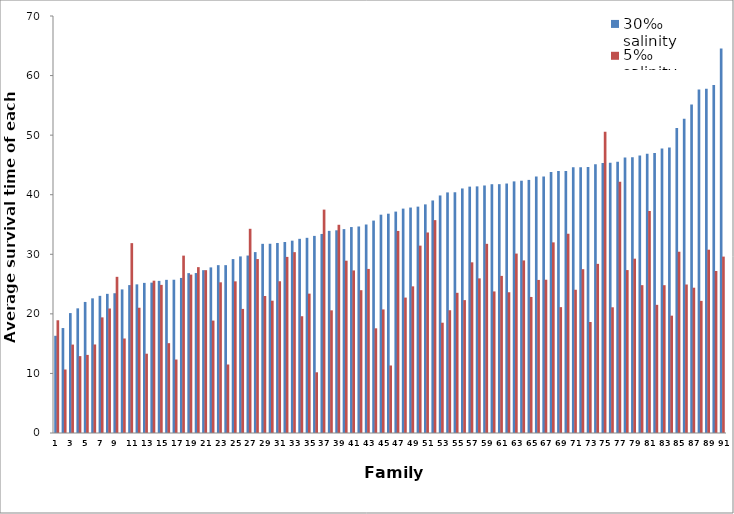
| Category | 30‰ salinity | 5‰ salinity |
|---|---|---|
| 1.0 | 16.319 | 18.923 |
| 2.0 | 17.619 | 10.659 |
| 3.0 | 20.132 | 14.842 |
| 4.0 | 20.927 | 12.906 |
| 5.0 | 22 | 13.111 |
| 6.0 | 22.605 | 14.861 |
| 7.0 | 23.024 | 19.41 |
| 8.0 | 23.359 | 20.9 |
| 9.0 | 23.462 | 26.216 |
| 10.0 | 24.103 | 15.864 |
| 11.0 | 24.829 | 31.872 |
| 12.0 | 24.951 | 21.029 |
| 13.0 | 25.2 | 13.31 |
| 14.0 | 25.238 | 25.568 |
| 15.0 | 25.537 | 24.864 |
| 16.0 | 25.711 | 15.079 |
| 17.0 | 25.729 | 12.333 |
| 18.0 | 26.029 | 29.775 |
| 19.0 | 26.837 | 26.588 |
| 20.0 | 26.85 | 27.842 |
| 21.0 | 27.333 | 27.333 |
| 22.0 | 27.8 | 18.871 |
| 23.0 | 28.175 | 25.294 |
| 24.0 | 28.176 | 11.5 |
| 25.0 | 29.195 | 25.457 |
| 26.0 | 29.641 | 20.829 |
| 27.0 | 29.789 | 34.278 |
| 28.0 | 30.368 | 29.2 |
| 29.0 | 31.756 | 23 |
| 30.0 | 31.767 | 22.209 |
| 31.0 | 31.9 | 25.474 |
| 32.0 | 32.059 | 29.561 |
| 33.0 | 32.286 | 30.359 |
| 34.0 | 32.595 | 19.601 |
| 35.0 | 32.765 | 23.395 |
| 36.0 | 33.087 | 10.19 |
| 37.0 | 33.415 | 37.5 |
| 38.0 | 33.932 | 20.591 |
| 39.0 | 34.026 | 34.953 |
| 40.0 | 34.225 | 28.923 |
| 41.0 | 34.571 | 27.289 |
| 42.0 | 34.667 | 23.974 |
| 43.0 | 35 | 27.543 |
| 44.0 | 35.658 | 17.575 |
| 45.0 | 36.648 | 20.743 |
| 46.0 | 36.816 | 11.333 |
| 47.0 | 37.167 | 33.919 |
| 48.0 | 37.667 | 22.732 |
| 49.0 | 37.846 | 24.617 |
| 50.0 | 38 | 31.452 |
| 51.0 | 38.378 | 33.659 |
| 52.0 | 39.036 | 35.735 |
| 53.0 | 39.875 | 18.514 |
| 54.0 | 40.386 | 20.61 |
| 55.0 | 40.412 | 23.533 |
| 56.0 | 41.05 | 22.306 |
| 57.0 | 41.357 | 28.65 |
| 58.0 | 41.4 | 25.957 |
| 59.0 | 41.55 | 31.756 |
| 60.0 | 41.762 | 23.763 |
| 61.0 | 41.769 | 26.372 |
| 62.0 | 41.878 | 23.625 |
| 63.0 | 42.237 | 30.119 |
| 64.0 | 42.351 | 28.97 |
| 65.0 | 42.488 | 22.839 |
| 66.0 | 43.056 | 25.694 |
| 67.0 | 43.075 | 25.732 |
| 68.0 | 43.806 | 32 |
| 69.0 | 43.971 | 21.128 |
| 70.0 | 43.974 | 33.45 |
| 71.0 | 44.625 | 24.047 |
| 72.0 | 44.625 | 27.5 |
| 73.0 | 44.667 | 18.629 |
| 74.0 | 45.098 | 28.395 |
| 75.0 | 45.342 | 50.575 |
| 76.0 | 45.358 | 21.103 |
| 77.0 | 45.554 | 42.176 |
| 78.0 | 46.244 | 27.35 |
| 79.0 | 46.281 | 29.263 |
| 80.0 | 46.575 | 24.816 |
| 81.0 | 46.872 | 37.271 |
| 82.0 | 47.023 | 21.514 |
| 83.0 | 47.758 | 24.811 |
| 84.0 | 47.946 | 19.697 |
| 85.0 | 51.205 | 30.429 |
| 86.0 | 52.771 | 24.925 |
| 87.0 | 55.125 | 24.39 |
| 88.0 | 57.659 | 22.179 |
| 89.0 | 57.789 | 30.769 |
| 90.0 | 58.432 | 27.19 |
| 91.0 | 64.564 | 29.61 |